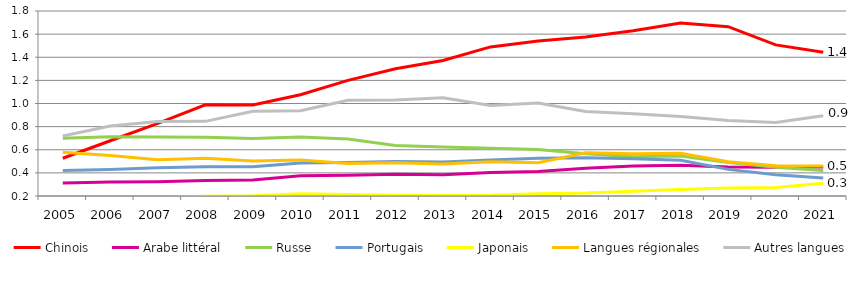
| Category | Chinois | Arabe littéral | Russe | Portugais | Japonais | Langues régionales | Autres langues |
|---|---|---|---|---|---|---|---|
| 2005 | 0.527 | 0.313 | 0.699 | 0.421 | 0.16 | 0.577 | 0.718 |
| 2006 | 0.678 | 0.321 | 0.712 | 0.429 | 0.173 | 0.55 | 0.806 |
| 2007 | 0.828 | 0.324 | 0.709 | 0.444 | 0.185 | 0.513 | 0.844 |
| 2008 | 0.988 | 0.334 | 0.708 | 0.452 | 0.199 | 0.527 | 0.845 |
| 2009 | 0.987 | 0.339 | 0.697 | 0.453 | 0.202 | 0.503 | 0.933 |
| 2010 | 1.076 | 0.376 | 0.71 | 0.486 | 0.218 | 0.511 | 0.937 |
| 2011 | 1.2 | 0.379 | 0.692 | 0.489 | 0.212 | 0.48 | 1.029 |
| 2012 | 1.301 | 0.387 | 0.636 | 0.497 | 0.207 | 0.488 | 1.031 |
| 2013 | 1.372 | 0.384 | 0.625 | 0.493 | 0.204 | 0.477 | 1.05 |
| 2014 | 1.489 | 0.403 | 0.612 | 0.511 | 0.207 | 0.497 | 0.983 |
| 2015 | 1.54 | 0.412 | 0.602 | 0.526 | 0.22 | 0.488 | 1.005 |
| 2016 | 1.575 | 0.441 | 0.565 | 0.53 | 0.226 | 0.574 | 0.931 |
| 2017 | 1.629 | 0.46 | 0.539 | 0.523 | 0.242 | 0.564 | 0.912 |
| 2018 | 1.697 | 0.467 | 0.545 | 0.51 | 0.255 | 0.57 | 0.888 |
| 2019 | 1.664 | 0.451 | 0.489 | 0.43 | 0.27 | 0.496 | 0.853 |
| 2020 | 1.507 | 0.448 | 0.45 | 0.383 | 0.274 | 0.462 | 0.837 |
| 2021 | 1.443 | 0.451 | 0.421 | 0.357 | 0.311 | 0.459 | 0.895 |